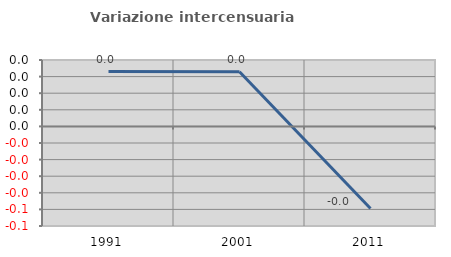
| Category | Variazione intercensuaria annua |
|---|---|
| 1991.0 | 0.033 |
| 2001.0 | 0.033 |
| 2011.0 | -0.049 |